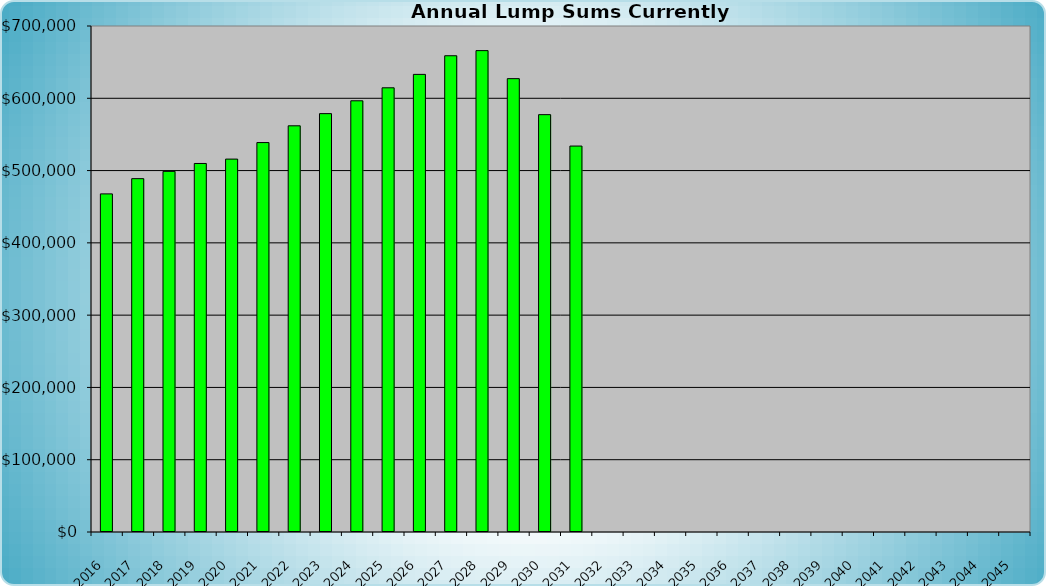
| Category | Amount of Funds Available to Meet All Needs |
|---|---|
| 2016.0 | 467755 |
| 2017.0 | 488817.598 |
| 2018.0 | 498893.472 |
| 2019.0 | 509818.03 |
| 2020.0 | 515872.753 |
| 2021.0 | 538738.824 |
| 2022.0 | 561932.175 |
| 2023.0 | 578758.962 |
| 2024.0 | 596533.382 |
| 2025.0 | 614503.159 |
| 2026.0 | 633065.795 |
| 2027.0 | 658860.296 |
| 2028.0 | 665951.242 |
| 2029.0 | 627173.321 |
| 2030.0 | 577354.412 |
| 2031.0 | 533910.077 |
| 2032.0 | 0 |
| 2033.0 | 0 |
| 2034.0 | 0 |
| 2035.0 | 0 |
| 2036.0 | 0 |
| 2037.0 | 0 |
| 2038.0 | 0 |
| 2039.0 | 0 |
| 2040.0 | 0 |
| 2041.0 | 0 |
| 2042.0 | 0 |
| 2043.0 | 0 |
| 2044.0 | 0 |
| 2045.0 | 0 |